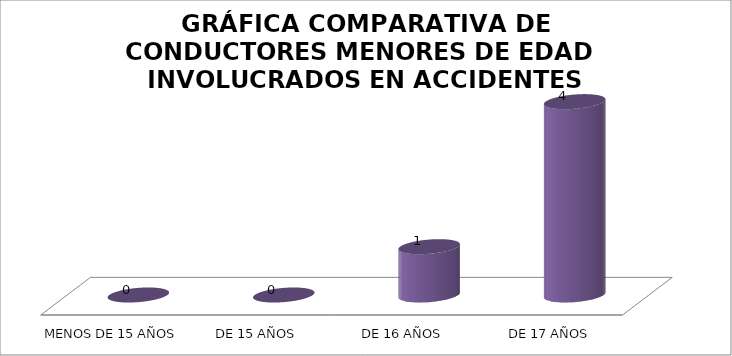
| Category | Series 0 |
|---|---|
| MENOS DE 15 AÑOS | 0 |
| DE 15 AÑOS | 0 |
| DE 16 AÑOS | 1 |
|  DE 17 AÑOS | 4 |